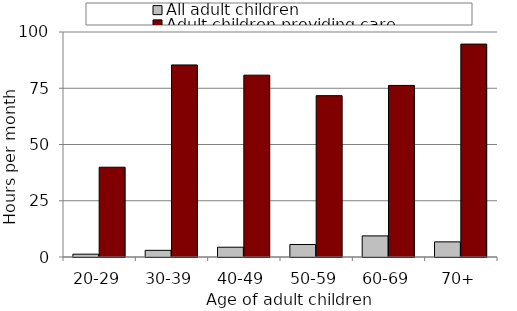
| Category | All adult children | Adult children providing care |
|---|---|---|
| 20-29 | 1.255 | 39.9 |
| 30-39 | 2.959 | 85.358 |
| 40-49 | 4.349 | 80.816 |
| 50-59 | 5.556 | 71.705 |
| 60-69 | 9.379 | 76.255 |
| 70+ | 6.725 | 94.619 |